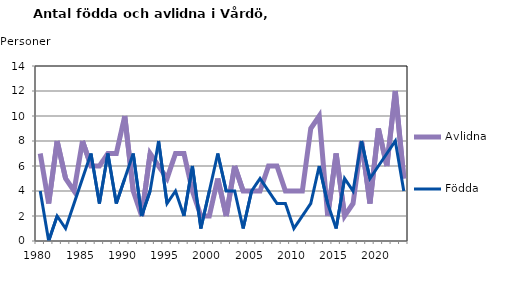
| Category | Avlidna | Födda |
|---|---|---|
| 1980.0 | 7 | 4 |
| 1981.0 | 3 | 0 |
| 1982.0 | 8 | 2 |
| 1983.0 | 5 | 1 |
| 1984.0 | 4 | 3 |
| 1985.0 | 8 | 5 |
| 1986.0 | 6 | 7 |
| 1987.0 | 6 | 3 |
| 1988.0 | 7 | 7 |
| 1989.0 | 7 | 3 |
| 1990.0 | 10 | 5 |
| 1991.0 | 4 | 7 |
| 1992.0 | 2 | 2 |
| 1993.0 | 7 | 4 |
| 1994.0 | 6 | 8 |
| 1995.0 | 5 | 3 |
| 1996.0 | 7 | 4 |
| 1997.0 | 7 | 2 |
| 1998.0 | 4 | 6 |
| 1999.0 | 2 | 1 |
| 2000.0 | 2 | 4 |
| 2001.0 | 5 | 7 |
| 2002.0 | 2 | 4 |
| 2003.0 | 6 | 4 |
| 2004.0 | 4 | 1 |
| 2005.0 | 4 | 4 |
| 2006.0 | 4 | 5 |
| 2007.0 | 6 | 4 |
| 2008.0 | 6 | 3 |
| 2009.0 | 4 | 3 |
| 2010.0 | 4 | 1 |
| 2011.0 | 4 | 2 |
| 2012.0 | 9 | 3 |
| 2013.0 | 10 | 6 |
| 2014.0 | 2 | 3 |
| 2015.0 | 7 | 1 |
| 2016.0 | 2 | 5 |
| 2017.0 | 3 | 4 |
| 2018.0 | 8 | 8 |
| 2019.0 | 3 | 5 |
| 2020.0 | 9 | 6 |
| 2021.0 | 6 | 7 |
| 2022.0 | 12 | 8 |
| 2023.0 | 5 | 4 |